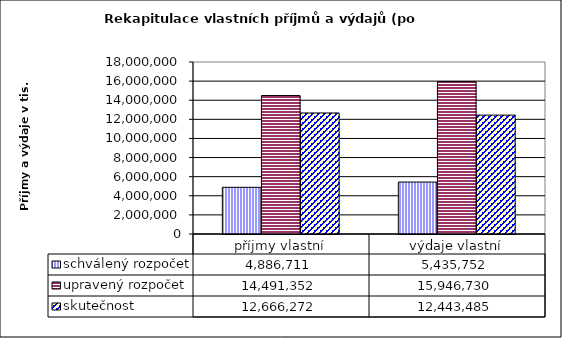
| Category | schválený rozpočet | upravený rozpočet | skutečnost |
|---|---|---|---|
| příjmy vlastní | 4886711 | 14491352 | 12666272 |
| výdaje vlastní | 5435752 | 15946730 | 12443485 |